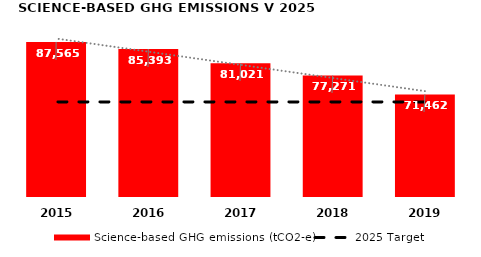
| Category | Science-based GHG emissions (tCO2-e) |
|---|---|
| 2019.0 | 71461.72 |
| 2018.0 | 77271 |
| 2017.0 | 81021 |
| 2016.0 | 85393 |
| 2015.0 | 87565 |